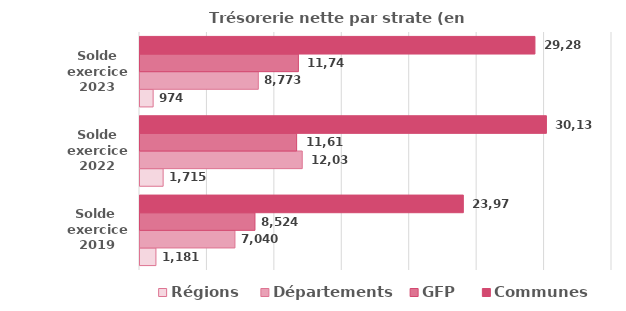
| Category | Régions | Départements | GFP | Communes  |
|---|---|---|---|---|
| Solde 
exercice 2019 | 1180.9 | 7040.2 | 8524.1 | 23976.6 |
| Solde
exercice 2022 | 1715.1 | 12031.2 | 11614.5 | 30137.7 |
| Solde
exercice 2023 | 974.1 | 8772.6 | 11745.7 | 29286.6 |